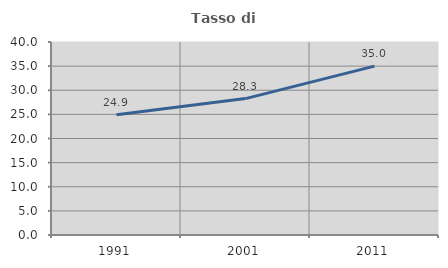
| Category | Tasso di occupazione   |
|---|---|
| 1991.0 | 24.9 |
| 2001.0 | 28.272 |
| 2011.0 | 35 |